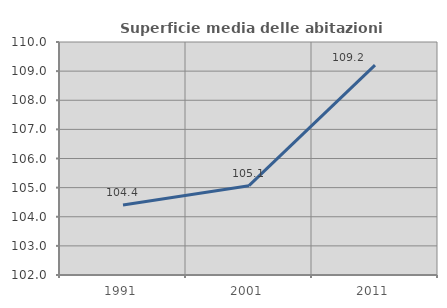
| Category | Superficie media delle abitazioni occupate |
|---|---|
| 1991.0 | 104.402 |
| 2001.0 | 105.067 |
| 2011.0 | 109.205 |